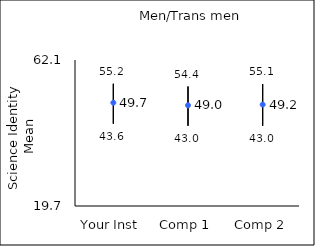
| Category | 25th percentile | 75th percentile | Mean |
|---|---|---|---|
| Your Inst | 43.6 | 55.2 | 49.7 |
| Comp 1 | 43 | 54.4 | 48.95 |
| Comp 2 | 43 | 55.1 | 49.15 |